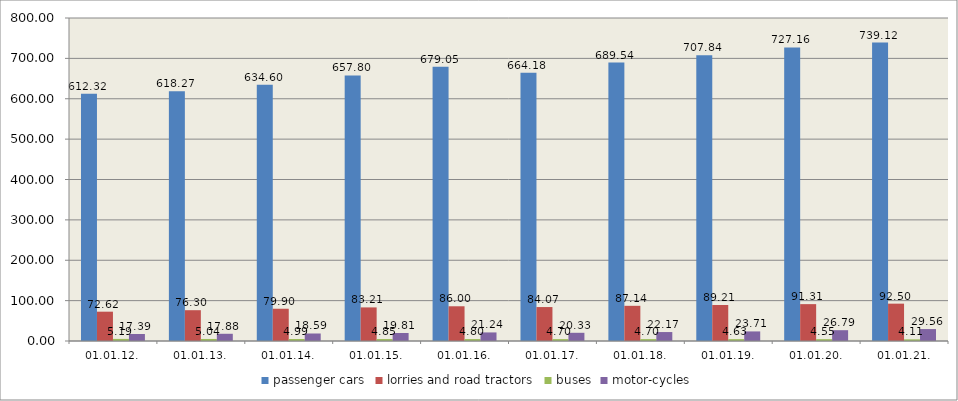
| Category | passenger cars | lorries and road tractors | buses | motor-cycles |
|---|---|---|---|---|
| 01.01.12. | 612.321 | 72.622 | 5.186 | 17.385 |
| 01.01.13. | 618.274 | 76.303 | 5.044 | 17.879 |
| 01.01.14. | 634.603 | 79.899 | 4.989 | 18.587 |
| 01.01.15. | 657.799 | 83.205 | 4.845 | 19.807 |
| 01.01.16. | 679.048 | 85.998 | 4.797 | 21.241 |
| 01.01.17. | 664.177 | 84.067 | 4.696 | 20.329 |
| 01.01.18. | 689.536 | 87.143 | 4.701 | 22.166 |
| 01.01.19. | 707.841 | 89.211 | 4.632 | 23.713 |
| 01.01.20. | 727.164 | 91.311 | 4.549 | 26.785 |
| 01.01.21. | 739.124 | 92.499 | 4.105 | 29.561 |